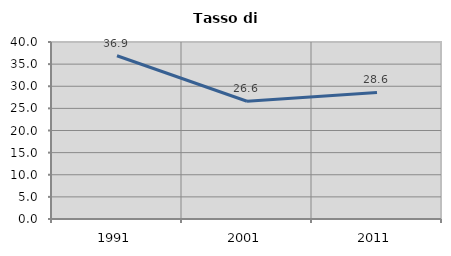
| Category | Tasso di disoccupazione   |
|---|---|
| 1991.0 | 36.884 |
| 2001.0 | 26.611 |
| 2011.0 | 28.608 |